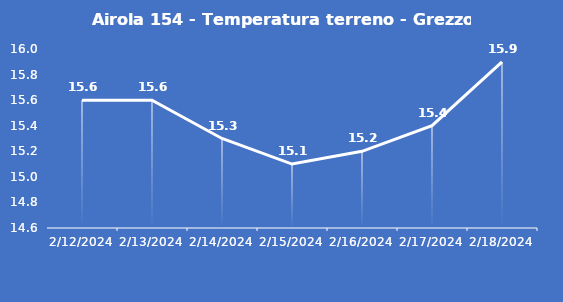
| Category | Airola 154 - Temperatura terreno - Grezzo (°C) |
|---|---|
| 2/12/24 | 15.6 |
| 2/13/24 | 15.6 |
| 2/14/24 | 15.3 |
| 2/15/24 | 15.1 |
| 2/16/24 | 15.2 |
| 2/17/24 | 15.4 |
| 2/18/24 | 15.9 |